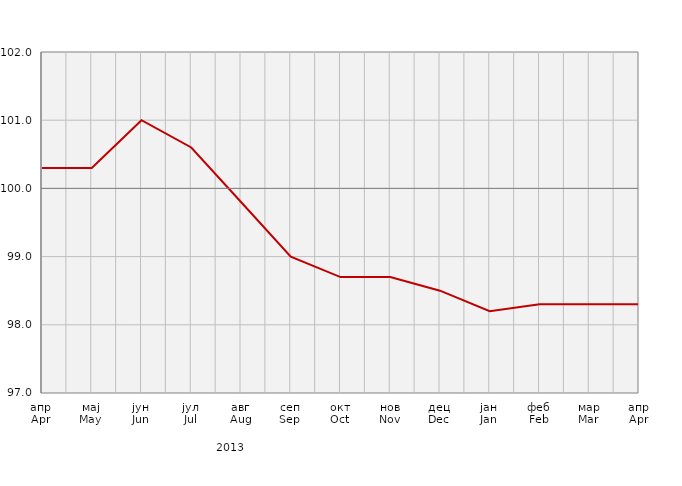
| Category | Индекси потрошачких цијена
Consumer price indices |
|---|---|
| апр
Apr | 100.3 |
| мај
May | 100.3 |
| јун
Jun | 101 |
| јул
Jul | 100.6 |
| авг
Aug | 99.8 |
| сеп
Sep | 99 |
| окт
Oct | 98.7 |
| нов
Nov | 98.7 |
| дец
Dec | 98.5 |
| јан
Jan | 98.2 |
| феб
Feb | 98.3 |
| мар
Mar | 98.3 |
| апр
Apr | 98.3 |